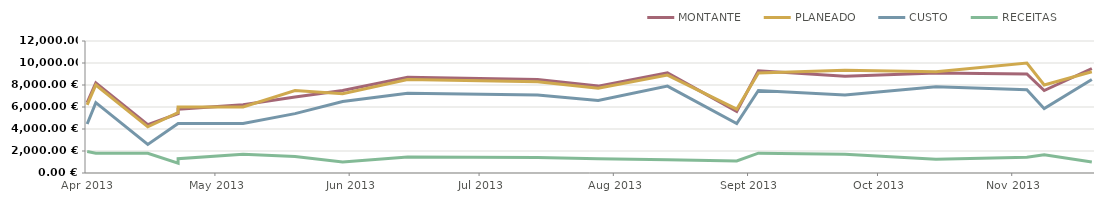
| Category | MONTANTE | PLANEADO | CUSTO | RECEITAS |
|---|---|---|---|---|
| 2013-04-23 | 6400 | 6200 | 4450 | 1950 |
| 2013-04-25 | 8200 | 8000 | 6400 | 1800 |
| 2013-05-07 | 4400 | 4200 | 2600 | 1800 |
| 2013-05-14 | 5400 | 5500 | 4500 | 900 |
| 2013-05-14 | 5800 | 6000 | 4500 | 1300 |
| 2013-05-29 | 6200 | 6000 | 4500 | 1700 |
| 2013-06-10 | 6900 | 7500 | 5400 | 1500 |
| 2013-06-21 | 7500 | 7200 | 6500 | 1000 |
| 2013-07-06 | 8700 | 8500 | 7250 | 1450 |
| 2013-08-05 | 8500 | 8300 | 7100 | 1400 |
| 2013-08-19 | 7900 | 7700 | 6600 | 1300 |
| 2013-09-04 | 9100 | 8900 | 7900 | 1200 |
| 2013-09-20 | 5600 | 5800 | 4500 | 1100 |
| 2013-09-25 | 9300 | 9100 | 7500 | 1800 |
| 2013-10-15 | 8800 | 9350 | 7100 | 1700 |
| 2013-11-05 | 9100 | 9200 | 7850 | 1250 |
| 2013-11-26 | 9000 | 10000 | 7575 | 1425 |
| 2013-11-30 | 7500 | 8000 | 5850 | 1650 |
| 2013-12-11 | 9500 | 9200 | 8500 | 1000 |